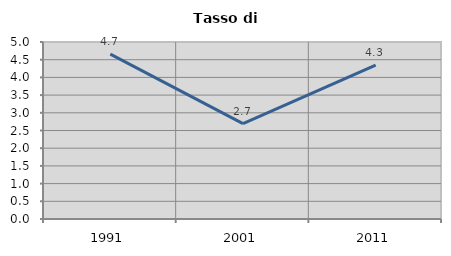
| Category | Tasso di disoccupazione   |
|---|---|
| 1991.0 | 4.655 |
| 2001.0 | 2.695 |
| 2011.0 | 4.347 |